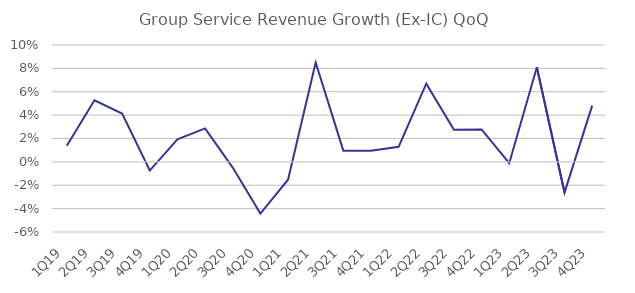
| Category | Group Service Revenue Growth (Ex-IC) QoQ |
|---|---|
| 1Q19 | 0.014 |
| 2Q19 | 0.053 |
| 3Q19 | 0.041 |
| 4Q19 | -0.007 |
| 1Q20 | 0.019 |
| 2Q20 | 0.029 |
| 3Q20 | -0.005 |
| 4Q20 | -0.044 |
| 1Q21 | -0.015 |
| 2Q21 | 0.085 |
| 3Q21 | 0.01 |
| 4Q21 | 0.009 |
| 1Q22 | 0.013 |
| 2Q22 | 0.067 |
| 3Q22 | 0.028 |
| 4Q22 | 0.028 |
| 1Q23 | -0.001 |
| 2Q23 | 0.081 |
| 3Q23 | -0.026 |
| 4Q23 | 0.048 |